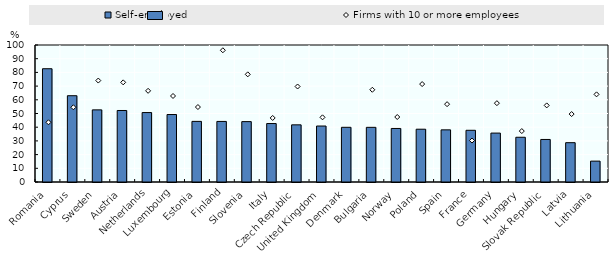
| Category | Self-employed |
|---|---|
| Romania | 82.68 |
| Cyprus | 62.99 |
| Sweden | 52.65 |
| Austria | 52.19 |
| Netherlands | 50.69 |
| Luxembourg | 49.25 |
| Estonia | 44.25 |
| Finland | 44.21 |
| Slovenia | 44.07 |
| Italy | 42.67 |
| Czech Republic | 41.72 |
| United Kingdom | 40.86 |
| Denmark | 39.92 |
| Bulgaria | 39.9 |
| Norway | 39.08 |
| Poland | 38.53 |
| Spain | 38.07 |
| France | 37.75 |
| Germany | 35.7 |
| Hungary | 32.66 |
| Slovak Republic | 31.05 |
| Latvia | 28.7 |
| Lithuania | 15.23 |